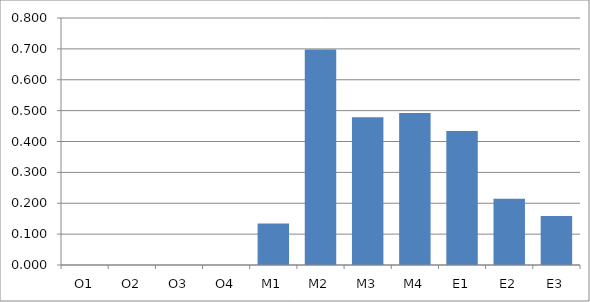
| Category | Series 0 |
|---|---|
| O1 | 0 |
| O2 | 0 |
| O3 | 0 |
| O4 | 0 |
| M1 | 0.135 |
| M2 | 0.698 |
| M3 | 0.479 |
| M4 | 0.493 |
| E1 | 0.434 |
| E2 | 0.215 |
| E3 | 0.159 |